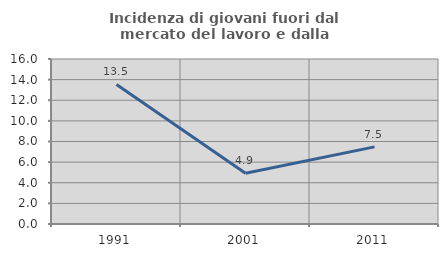
| Category | Incidenza di giovani fuori dal mercato del lavoro e dalla formazione  |
|---|---|
| 1991.0 | 13.529 |
| 2001.0 | 4.93 |
| 2011.0 | 7.477 |